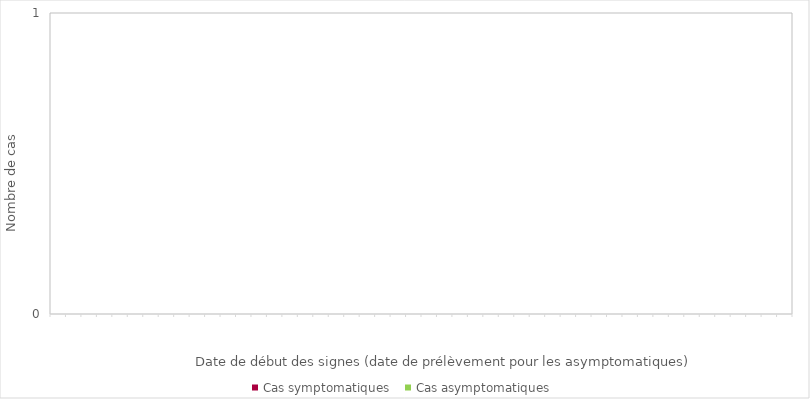
| Category | Cas symptomatiques | Cas asymptomatiques |
|---|---|---|
| 0 | 0 | 0 |
| 1900-01-01 | 0 | 0 |
| 1900-01-02 | 0 | 0 |
| 1900-01-03 | 0 | 0 |
| 1900-01-04 | 0 | 0 |
| 1900-01-05 | 0 | 0 |
| 1900-01-06 | 0 | 0 |
| 1900-01-07 | 0 | 0 |
| 1900-01-08 | 0 | 0 |
| 1900-01-09 | 0 | 0 |
| 1900-01-10 | 0 | 0 |
| 1900-01-11 | 0 | 0 |
| 1900-01-12 | 0 | 0 |
| 1900-01-13 | 0 | 0 |
| 1900-01-14 | 0 | 0 |
| 1900-01-15 | 0 | 0 |
| 1900-01-16 | 0 | 0 |
| 1900-01-17 | 0 | 0 |
| 1900-01-18 | 0 | 0 |
| 1900-01-19 | 0 | 0 |
| 1900-01-20 | 0 | 0 |
| 1900-01-21 | 0 | 0 |
| 1900-01-22 | 0 | 0 |
| 1900-01-23 | 0 | 0 |
| 1900-01-24 | 0 | 0 |
| 1900-01-25 | 0 | 0 |
| 1900-01-26 | 0 | 0 |
| 1900-01-27 | 0 | 0 |
| 1900-01-28 | 0 | 0 |
| 1900-01-29 | 0 | 0 |
| 1900-01-30 | 0 | 0 |
| 1900-01-31 | 0 | 0 |
| 1900-02-01 | 0 | 0 |
| 1900-02-02 | 0 | 0 |
| 1900-02-03 | 0 | 0 |
| 1900-02-04 | 0 | 0 |
| 1900-02-05 | 0 | 0 |
| 1900-02-06 | 0 | 0 |
| 1900-02-07 | 0 | 0 |
| 1900-02-08 | 0 | 0 |
| 1900-02-09 | 0 | 0 |
| 1900-02-10 | 0 | 0 |
| 1900-02-11 | 0 | 0 |
| 1900-02-12 | 0 | 0 |
| 1900-02-13 | 0 | 0 |
| 1900-02-14 | 0 | 0 |
| 1900-02-15 | 0 | 0 |
| 1900-02-16 | 0 | 0 |